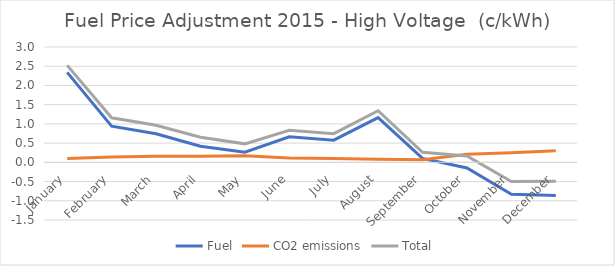
| Category | Fuel | CO2 emissions | Total |
|---|---|---|---|
| January | 2.34 | 0.098 | 2.522 |
| February | 0.94 | 0.137 | 1.158 |
| March | 0.741 | 0.156 | 0.964 |
| April | 0.419 | 0.16 | 0.651 |
| May | 0.262 | 0.174 | 0.481 |
| June | 0.665 | 0.11 | 0.835 |
| July | 0.576 | 0.101 | 0.745 |
| August | 1.163 | 0.08 | 1.343 |
| September | 0.102 | 0.068 | 0.262 |
| October | -0.146 | 0.208 | 0.167 |
| November | -0.832 | 0.251 | -0.498 |
| December | -0.864 | 0.302 | -0.49 |